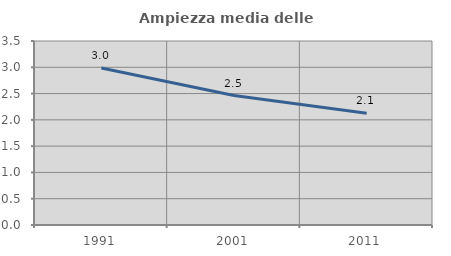
| Category | Ampiezza media delle famiglie |
|---|---|
| 1991.0 | 2.986 |
| 2001.0 | 2.462 |
| 2011.0 | 2.125 |